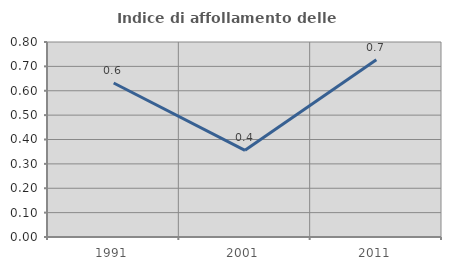
| Category | Indice di affollamento delle abitazioni  |
|---|---|
| 1991.0 | 0.632 |
| 2001.0 | 0.356 |
| 2011.0 | 0.727 |